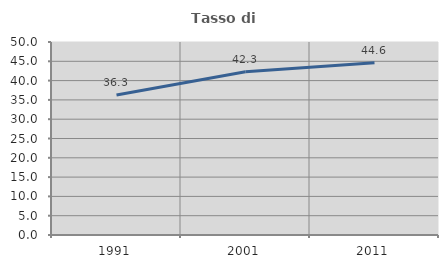
| Category | Tasso di occupazione   |
|---|---|
| 1991.0 | 36.258 |
| 2001.0 | 42.277 |
| 2011.0 | 44.619 |